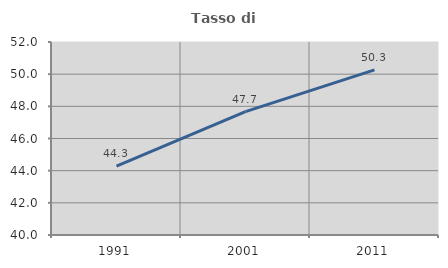
| Category | Tasso di occupazione   |
|---|---|
| 1991.0 | 44.277 |
| 2001.0 | 47.667 |
| 2011.0 | 50.269 |